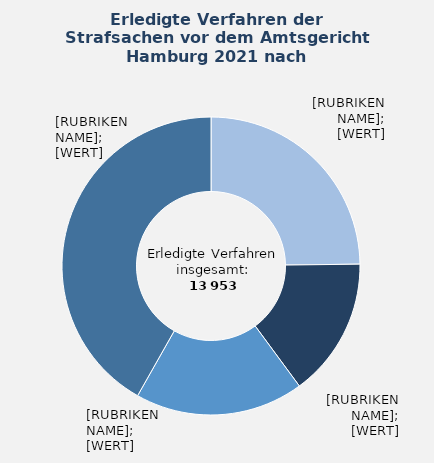
| Category | in Prozent |
|---|---|
| Eigentums- und Vermögensdelikte | 24.8 |
| Straftaten gegen das Leben und gegen die körperliche Unversehrtheit | 15.1 |
| Sonstige allgemeine Straftaten | 18.3 |
| Übrige¹ | 41.8 |